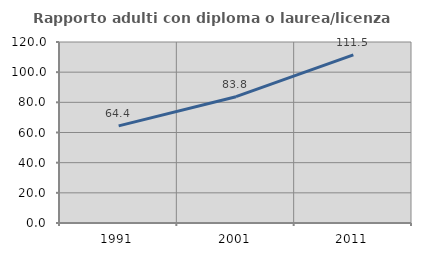
| Category | Rapporto adulti con diploma o laurea/licenza media  |
|---|---|
| 1991.0 | 64.393 |
| 2001.0 | 83.754 |
| 2011.0 | 111.5 |